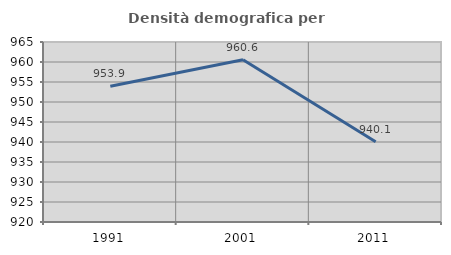
| Category | Densità demografica |
|---|---|
| 1991.0 | 953.942 |
| 2001.0 | 960.583 |
| 2011.0 | 940.081 |